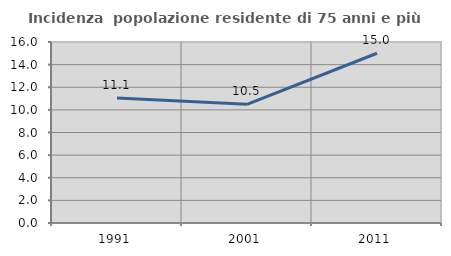
| Category | Incidenza  popolazione residente di 75 anni e più |
|---|---|
| 1991.0 | 11.058 |
| 2001.0 | 10.493 |
| 2011.0 | 15.007 |